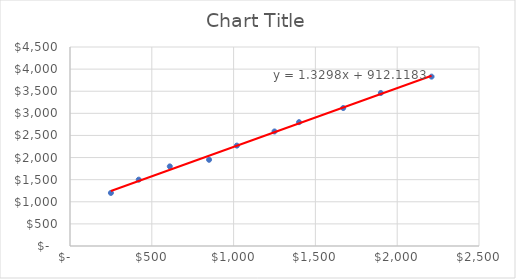
| Category | Series 0 |
|---|---|
| 250.0 | 1200 |
| 420.0 | 1500 |
| 610.0 | 1800 |
| 850.0 | 1950 |
| 1020.0 | 2270 |
| 1250.0 | 2590 |
| 1400.0 | 2800 |
| 1670.0 | 3120 |
| 1900.0 | 3460 |
| 2210.0 | 3830 |